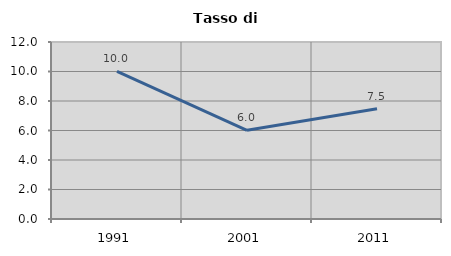
| Category | Tasso di disoccupazione   |
|---|---|
| 1991.0 | 10.016 |
| 2001.0 | 6.013 |
| 2011.0 | 7.48 |